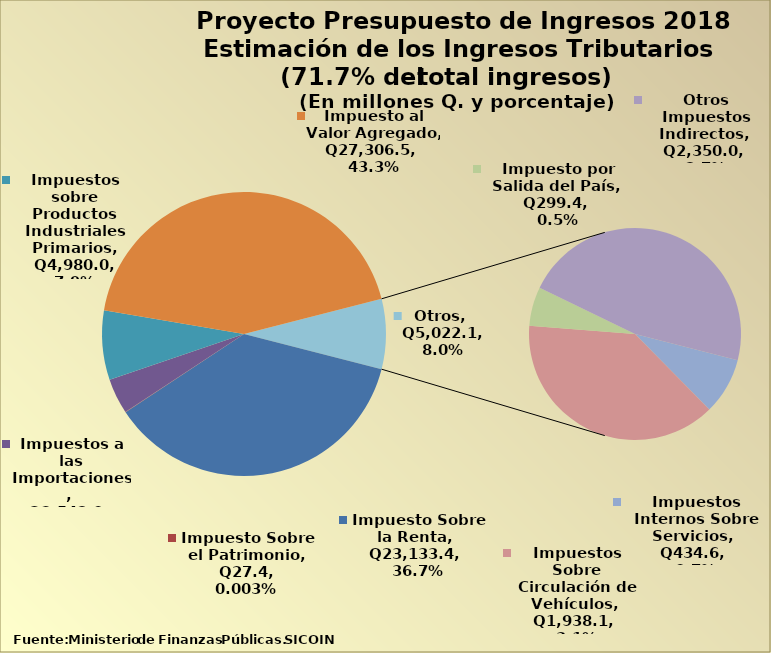
| Category | Series 0 |
|---|---|
| Impuesto Sobre la Renta | 23133.4 |
| Impuesto Sobre el Patrimonio | 27.4 |
| Otros Impuestos Directos | 0 |
| Impuestos a las Importaciones | 2543 |
| Impuestos sobre Productos Industriales Primarios | 4980 |
| Impuesto al Valor Agregado | 27306.5 |
| Impuestos Internos Sobre Servicios | 434.6 |
| Impuestos Sobre Circulación de Vehículos | 1938.1 |
| Impuesto por Salida del País | 299.4 |
| Otros Impuestos Indirectos | 2350 |